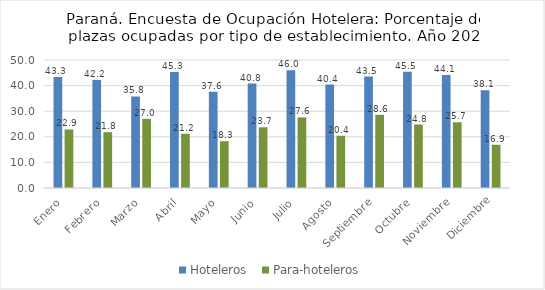
| Category | Hoteleros  | Para-hoteleros |
|---|---|---|
| Enero | 43.346 | 22.871 |
| Febrero | 42.2 | 21.807 |
| Marzo | 35.769 | 27.018 |
| Abril | 45.345 | 21.19 |
| Mayo | 37.625 | 18.271 |
| Junio | 40.774 | 23.715 |
| Julio | 46.023 | 27.564 |
| Agosto | 40.418 | 20.407 |
| Septiembre | 43.548 | 28.574 |
| Octubre | 45.455 | 24.797 |
| Noviembre | 44.094 | 25.673 |
| Diciembre | 38.14 | 16.895 |